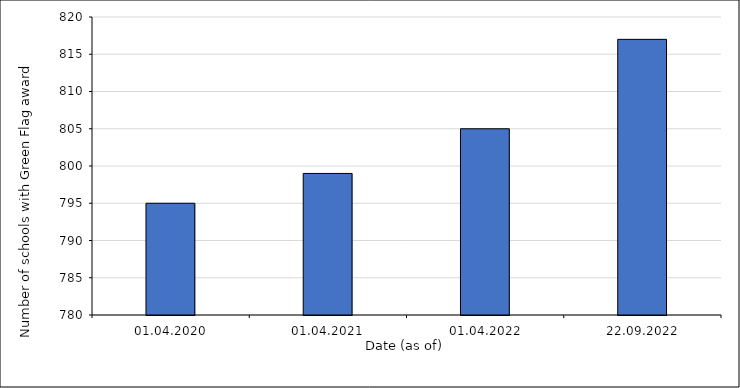
| Category | Number of schools with Green Flag Award |
|---|---|
| 01.04.2020 | 795 |
| 01.04.2021 | 799 |
| 01.04.2022 | 805 |
| 22.09.2022 | 817 |